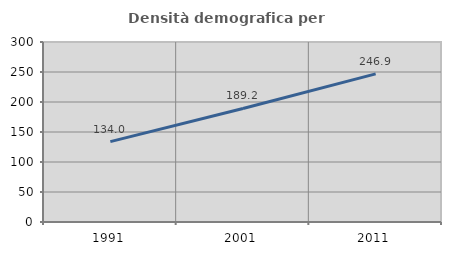
| Category | Densità demografica |
|---|---|
| 1991.0 | 134.02 |
| 2001.0 | 189.22 |
| 2011.0 | 246.893 |